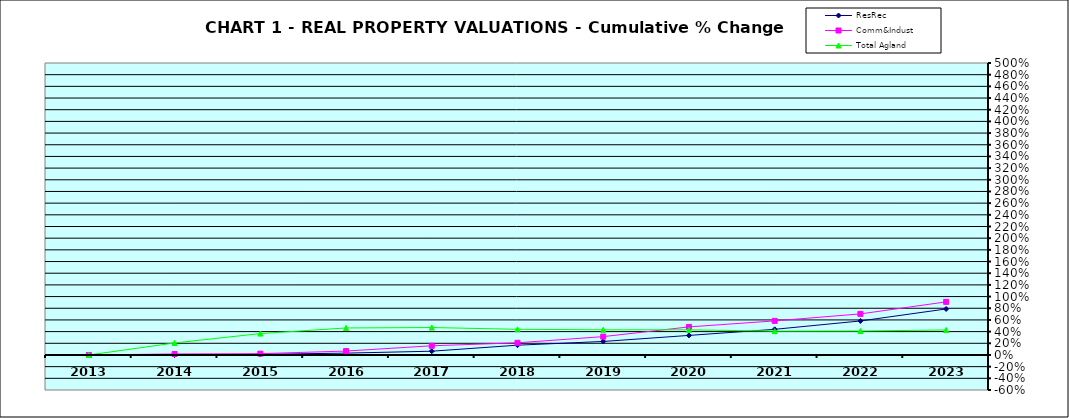
| Category | ResRec | Comm&Indust | Total Agland |
|---|---|---|---|
| 2013.0 | 0 | 0 | 0 |
| 2014.0 | -0.001 | 0.017 | 0.206 |
| 2015.0 | 0.011 | 0.022 | 0.367 |
| 2016.0 | 0.031 | 0.067 | 0.463 |
| 2017.0 | 0.064 | 0.157 | 0.47 |
| 2018.0 | 0.168 | 0.208 | 0.439 |
| 2019.0 | 0.231 | 0.314 | 0.431 |
| 2020.0 | 0.335 | 0.48 | 0.43 |
| 2021.0 | 0.439 | 0.584 | 0.409 |
| 2022.0 | 0.582 | 0.703 | 0.41 |
| 2023.0 | 0.788 | 0.909 | 0.428 |